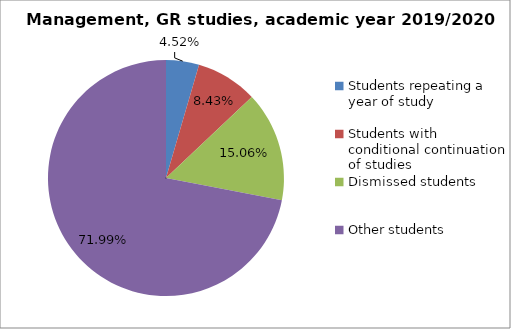
| Category | Series 0 |
|---|---|
| Students repeating a year of study | 15 |
| Students with conditional continuation of studies | 28 |
| Dismissed students | 50 |
| Other students | 239 |